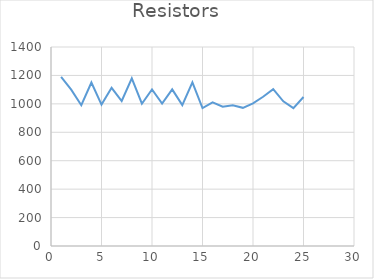
| Category | Series 0 |
|---|---|
| 1.0 | 1190 |
| 2.0 | 1100 |
| 3.0 | 990 |
| 4.0 | 1150 |
| 5.0 | 995 |
| 6.0 | 1113 |
| 7.0 | 1020 |
| 8.0 | 1180 |
| 9.0 | 1001 |
| 10.0 | 1101 |
| 11.0 | 1002 |
| 12.0 | 1102 |
| 13.0 | 991 |
| 14.0 | 1151 |
| 15.0 | 970 |
| 16.0 | 1010 |
| 17.0 | 980 |
| 18.0 | 990 |
| 19.0 | 972 |
| 20.0 | 1003 |
| 21.0 | 1050 |
| 22.0 | 1103 |
| 23.0 | 1018 |
| 24.0 | 970 |
| 25.0 | 1048 |